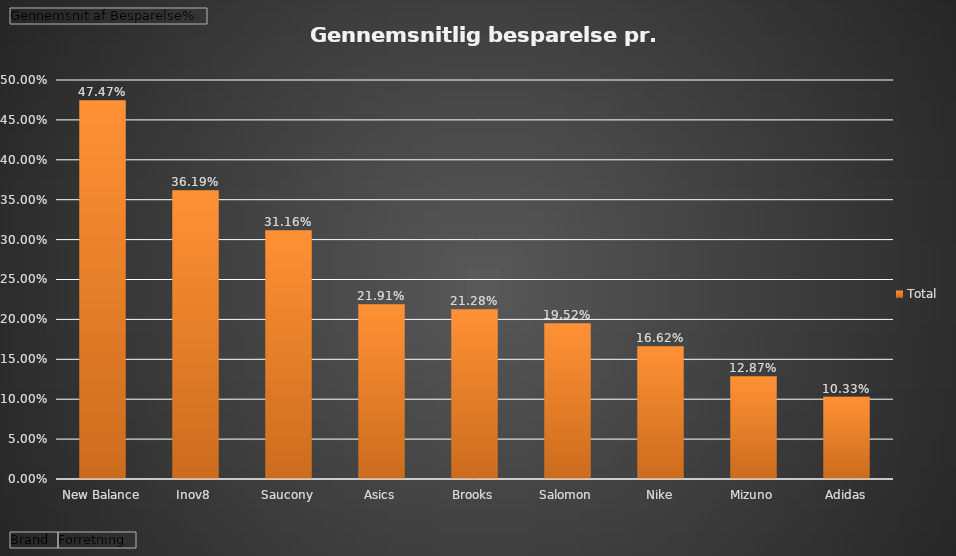
| Category | Total |
|---|---|
| New Balance | 0.475 |
| Inov8 | 0.362 |
| Saucony | 0.312 |
| Asics | 0.219 |
| Brooks | 0.213 |
| Salomon | 0.195 |
| Nike | 0.166 |
| Mizuno | 0.129 |
| Adidas | 0.103 |